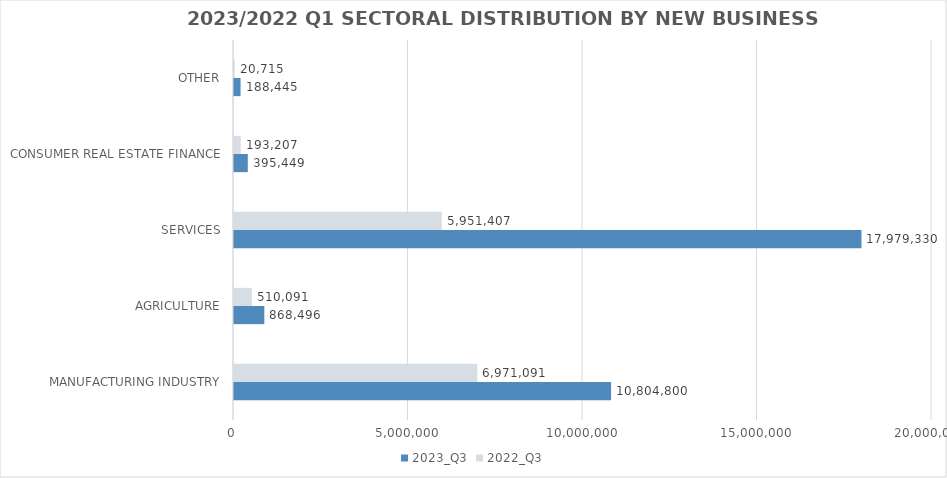
| Category | 2023_Q3 | 2022_Q3 |
|---|---|---|
| MANUFACTURING INDUSTRY | 10804800.443 | 6971091 |
| AGRICULTURE | 868496.423 | 510091 |
| SERVICES | 17979329.583 | 5951407 |
| CONSUMER REAL ESTATE FINANCE | 395449 | 193207 |
| OTHER | 188445 | 20715 |